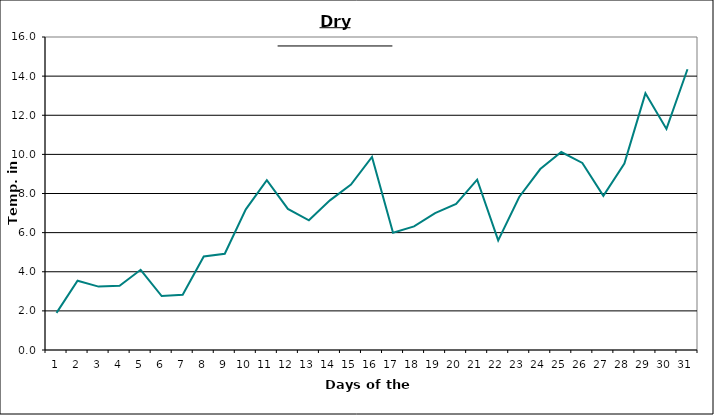
| Category | Series 0 |
|---|---|
| 0 | 1.9 |
| 1 | 3.54 |
| 2 | 3.24 |
| 3 | 3.28 |
| 4 | 4.1 |
| 5 | 2.76 |
| 6 | 2.82 |
| 7 | 4.78 |
| 8 | 4.92 |
| 9 | 7.19 |
| 10 | 8.68 |
| 11 | 7.21 |
| 12 | 6.63 |
| 13 | 7.65 |
| 14 | 8.46 |
| 15 | 9.87 |
| 16 | 5.99 |
| 17 | 6.32 |
| 18 | 7 |
| 19 | 7.47 |
| 20 | 8.71 |
| 21 | 5.6 |
| 22 | 7.82 |
| 23 | 9.25 |
| 24 | 10.12 |
| 25 | 9.56 |
| 26 | 7.88 |
| 27 | 9.53 |
| 28 | 13.12 |
| 29 | 11.3 |
| 30 | 14.35 |